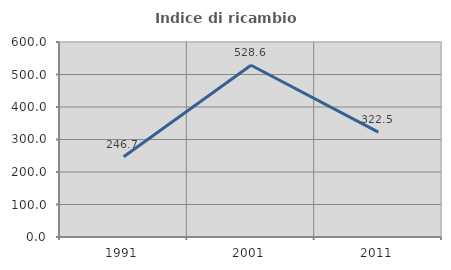
| Category | Indice di ricambio occupazionale  |
|---|---|
| 1991.0 | 246.667 |
| 2001.0 | 528.571 |
| 2011.0 | 322.5 |